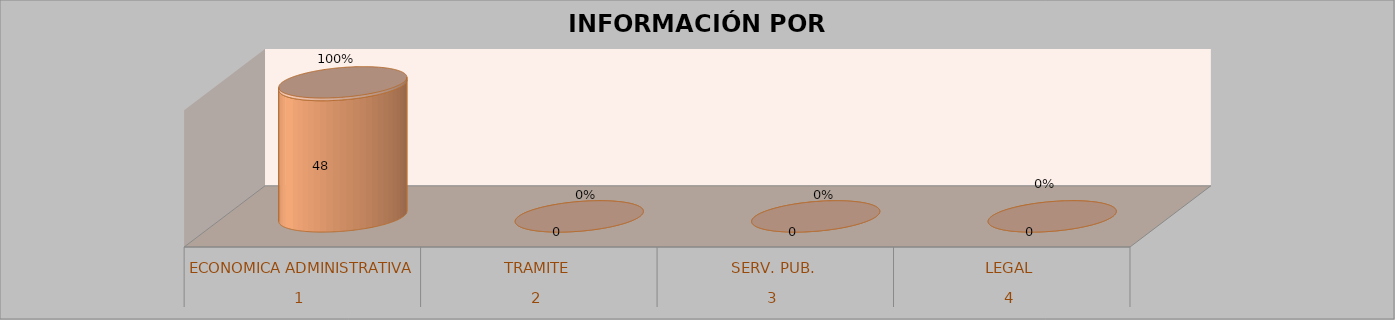
| Category | Series 0 | Series 1 | Series 2 | Series 3 |
|---|---|---|---|---|
| 0 |  |  | 48 | 1 |
| 1 |  |  | 0 | 0 |
| 2 |  |  | 0 | 0 |
| 3 |  |  | 0 | 0 |